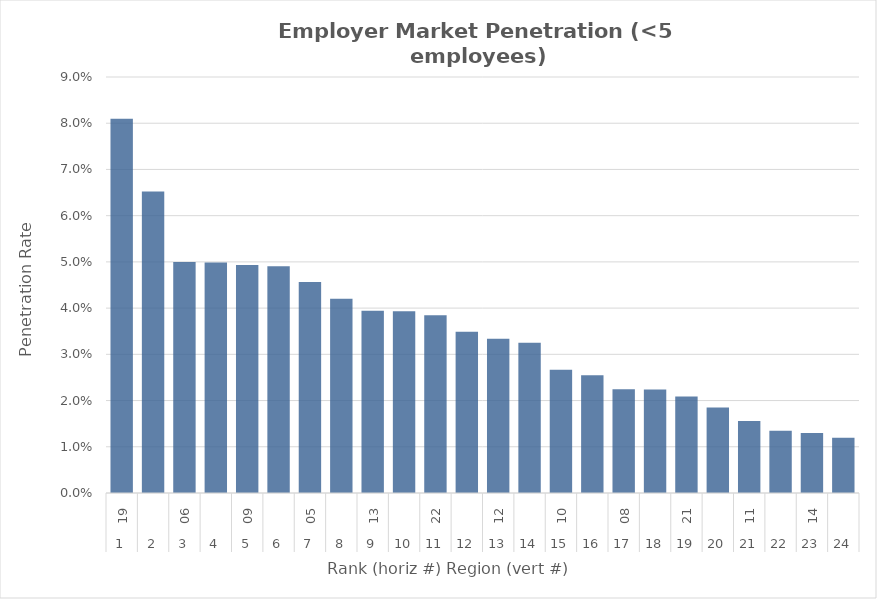
| Category | Rate |
|---|---|
| 0 | 0.081 |
| 1 | 0.065 |
| 2 | 0.05 |
| 3 | 0.05 |
| 4 | 0.049 |
| 5 | 0.049 |
| 6 | 0.046 |
| 7 | 0.042 |
| 8 | 0.039 |
| 9 | 0.039 |
| 10 | 0.038 |
| 11 | 0.035 |
| 12 | 0.033 |
| 13 | 0.033 |
| 14 | 0.027 |
| 15 | 0.025 |
| 16 | 0.022 |
| 17 | 0.022 |
| 18 | 0.021 |
| 19 | 0.018 |
| 20 | 0.016 |
| 21 | 0.013 |
| 22 | 0.013 |
| 23 | 0.012 |